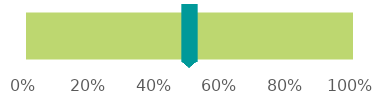
| Category | Top Conditions Opioids are Most Prescribed For | Condition |      Low Back Pain |
|---|---|---|---|
| 0 |  | 0 | 1 |